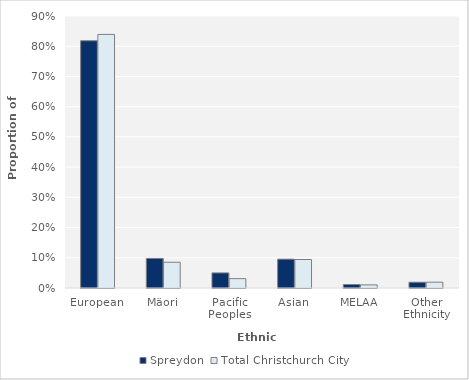
| Category | Spreydon | Total Christchurch City |
|---|---|---|
| European | 0.818 | 0.839 |
| Mäori | 0.098 | 0.085 |
| Pacific Peoples | 0.05 | 0.031 |
| Asian | 0.095 | 0.094 |
| MELAA | 0.011 | 0.01 |
| Other Ethnicity | 0.019 | 0.019 |